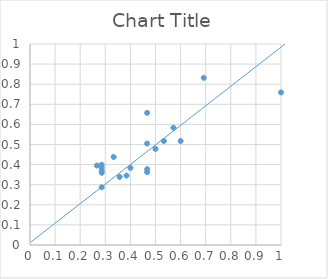
| Category | Series 0 |
|---|---|
| 0.2857142857142857 | 0.37 |
| 0.4666666666666667 | 0.505 |
| 0.38461538461538464 | 0.345 |
| 0.2857142857142857 | 0.399 |
| 0.4666666666666667 | 0.363 |
| 0.4666666666666667 | 0.657 |
| 0.4 | 0.383 |
| 0.5 | 0.478 |
| 0.6 | 0.517 |
| 1.0 | 0.759 |
| 0.6923076923076923 | 0.832 |
| 0.5333333333333333 | 0.517 |
| 0.35714285714285715 | 0.339 |
| 0.2857142857142857 | 0.287 |
| 0.4666666666666667 | 0.377 |
| 0.26666666666666666 | 0.395 |
| 0.5714285714285714 | 0.584 |
| 0.2857142857142857 | 0.384 |
| 0.2857142857142857 | 0.359 |
| 0.3333333333333333 | 0.438 |